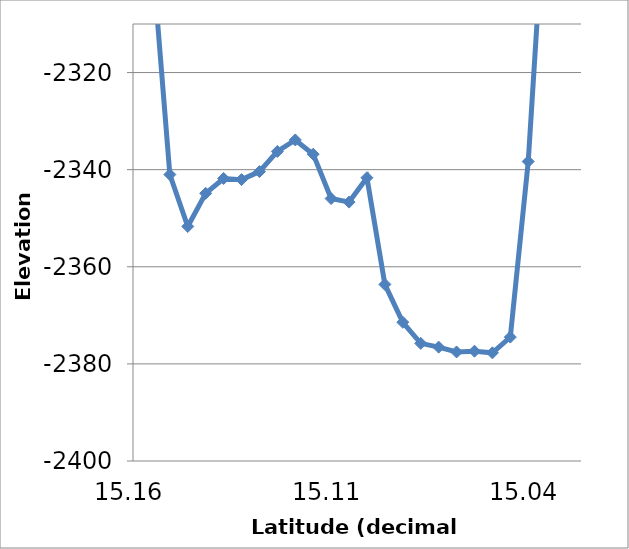
| Category | Series 0 |
|---|---|
| 15.1613 | -2164.29 |
| 15.1562 | -2295.08 |
| 15.1512 | -2341.01 |
| 15.1461 | -2351.7 |
| 15.141 | -2344.88 |
| 15.136 | -2341.81 |
| 15.1309 | -2342.05 |
| 15.1258 | -2340.4 |
| 15.1208 | -2336.25 |
| 15.1157 | -2333.88 |
| 15.1106 | -2336.81 |
| 15.1056 | -2345.95 |
| 15.1005 | -2346.68 |
| 15.0954 | -2341.66 |
| 15.0903 | -2363.63 |
| 15.0852 | -2371.43 |
| 15.0802 | -2375.77 |
| 15.0751 | -2376.55 |
| 15.07 | -2377.54 |
| 15.0649 | -2377.39 |
| 15.0599 | -2377.72 |
| 15.0548 | -2374.48 |
| 15.0446 | -2338.32 |
| 15.0396 | -2279.81 |
| 15.0345 | -2132.32 |
| 15.0294 | -2052.49 |